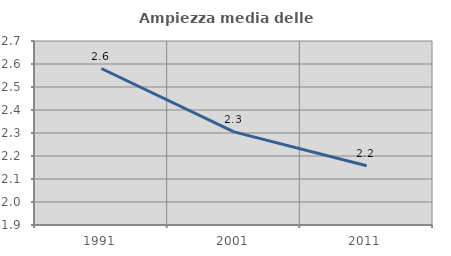
| Category | Ampiezza media delle famiglie |
|---|---|
| 1991.0 | 2.58 |
| 2001.0 | 2.305 |
| 2011.0 | 2.158 |